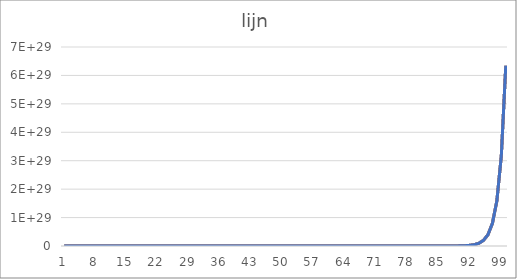
| Category | Series 2 | Series 3 | Series 1 | Series 0 |
|---|---|---|---|---|
| 0 | 1 | 1 | 1 | 1 |
| 1 | 2 | 2 | 2 | 2 |
| 2 | 4 | 4 | 4 | 4 |
| 3 | 8 | 8 | 8 | 8 |
| 4 | 16 | 16 | 16 | 16 |
| 5 | 32 | 32 | 32 | 32 |
| 6 | 64 | 64 | 64 | 64 |
| 7 | 128 | 128 | 128 | 128 |
| 8 | 256 | 256 | 256 | 256 |
| 9 | 512 | 512 | 512 | 512 |
| 10 | 1024 | 1024 | 1024 | 1024 |
| 11 | 2048 | 2048 | 2048 | 2048 |
| 12 | 4096 | 4096 | 4096 | 4096 |
| 13 | 8192 | 8192 | 8192 | 8192 |
| 14 | 16384 | 16384 | 16384 | 16384 |
| 15 | 32768 | 32768 | 32768 | 32768 |
| 16 | 65536 | 65536 | 65536 | 65536 |
| 17 | 131072 | 131072 | 131072 | 131072 |
| 18 | 262144 | 262144 | 262144 | 262144 |
| 19 | 524288 | 524288 | 524288 | 524288 |
| 20 | 1048576 | 1048576 | 1048576 | 1048576 |
| 21 | 2097152 | 2097152 | 2097152 | 2097152 |
| 22 | 4194304 | 4194304 | 4194304 | 4194304 |
| 23 | 8388608 | 8388608 | 8388608 | 8388608 |
| 24 | 16777216 | 16777216 | 16777216 | 16777216 |
| 25 | 33554432 | 33554432 | 33554432 | 33554432 |
| 26 | 67108864 | 67108864 | 67108864 | 67108864 |
| 27 | 134217728 | 134217728 | 134217728 | 134217728 |
| 28 | 268435456 | 268435456 | 268435456 | 268435456 |
| 29 | 536870912 | 536870912 | 536870912 | 536870912 |
| 30 | 1073741824 | 1073741824 | 1073741824 | 1073741824 |
| 31 | 2147483648 | 2147483648 | 2147483648 | 2147483648 |
| 32 | 4294967296 | 4294967296 | 4294967296 | 4294967296 |
| 33 | 8589934592 | 8589934592 | 8589934592 | 8589934592 |
| 34 | 17179869184 | 17179869184 | 17179869184 | 17179869184 |
| 35 | 34359738368 | 34359738368 | 34359738368 | 34359738368 |
| 36 | 68719476736 | 68719476736 | 68719476736 | 68719476736 |
| 37 | 137438953472 | 137438953472 | 137438953472 | 137438953472 |
| 38 | 274877906944 | 274877906944 | 274877906944 | 274877906944 |
| 39 | 549755813888 | 549755813888 | 549755813888 | 549755813888 |
| 40 | 1099511627776 | 1099511627776 | 1099511627776 | 1099511627776 |
| 41 | 2199023255552 | 2199023255552 | 2199023255552 | 2199023255552 |
| 42 | 4398046511104 | 4398046511104 | 4398046511104 | 4398046511104 |
| 43 | 8796093022208 | 8796093022208 | 8796093022208 | 8796093022208 |
| 44 | 17592186044416 | 17592186044416 | 17592186044416 | 17592186044416 |
| 45 | 35184372088832 | 35184372088832 | 35184372088832 | 35184372088832 |
| 46 | 70368744177664 | 70368744177664 | 70368744177664 | 70368744177664 |
| 47 | 140737488355328 | 140737488355328 | 140737488355328 | 140737488355328 |
| 48 | 281474976710656 | 281474976710656 | 281474976710656 | 281474976710656 |
| 49 | 562949953421312 | 562949953421312 | 562949953421312 | 562949953421312 |
| 50 | 1125899906842624 | 1125899906842624 | 1125899906842624 | 1125899906842624 |
| 51 | 2251799813685248 | 2251799813685248 | 2251799813685248 | 2251799813685248 |
| 52 | 4503599627370496 | 4503599627370496 | 4503599627370496 | 4503599627370496 |
| 53 | 9007199254740992 | 9007199254740992 | 9007199254740992 | 9007199254740992 |
| 54 | 18014398509481984 | 18014398509481984 | 18014398509481984 | 18014398509481984 |
| 55 | 36028797018963968 | 36028797018963968 | 36028797018963968 | 36028797018963968 |
| 56 | 72057594037927936 | 72057594037927936 | 72057594037927936 | 72057594037927936 |
| 57 | 144115188075855872 | 144115188075855872 | 144115188075855872 | 144115188075855872 |
| 58 | 288230376151711744 | 288230376151711744 | 288230376151711744 | 288230376151711744 |
| 59 | 576460752303423488 | 576460752303423488 | 576460752303423488 | 576460752303423488 |
| 60 | 1152921504606846976 | 1152921504606846976 | 1152921504606846976 | 1152921504606846976 |
| 61 | 2305843009213693952 | 2305843009213693952 | 2305843009213693952 | 2305843009213693952 |
| 62 | 4611686018427387904 | 4611686018427387904 | 4611686018427387904 | 4611686018427387904 |
| 63 | 9223372036854775808 | 9223372036854775808 | 9223372036854775808 | 9223372036854775808 |
| 64 | 18446744073709551616 | 18446744073709551616 | 18446744073709551616 | 18446744073709551616 |
| 65 | 36893488147419103232 | 36893488147419103232 | 36893488147419103232 | 36893488147419103232 |
| 66 | 73786976294838206464 | 73786976294838206464 | 73786976294838206464 | 73786976294838206464 |
| 67 | 147573952589676412928 | 147573952589676412928 | 147573952589676412928 | 147573952589676412928 |
| 68 | 295147905179352825856 | 295147905179352825856 | 295147905179352825856 | 295147905179352825856 |
| 69 | 590295810358705651712 | 590295810358705651712 | 590295810358705651712 | 590295810358705651712 |
| 70 | 1180591620717411303424 | 1180591620717411303424 | 1180591620717411303424 | 1180591620717411303424 |
| 71 | 2361183241434822606848 | 2361183241434822606848 | 2361183241434822606848 | 2361183241434822606848 |
| 72 | 4722366482869645213696 | 4722366482869645213696 | 4722366482869645213696 | 4722366482869645213696 |
| 73 | 9444732965739290427392 | 9444732965739290427392 | 9444732965739290427392 | 9444732965739290427392 |
| 74 | 18889465931478580854784 | 18889465931478580854784 | 18889465931478580854784 | 18889465931478580854784 |
| 75 | 37778931862957161709568 | 37778931862957161709568 | 37778931862957161709568 | 37778931862957161709568 |
| 76 | 75557863725914323419136 | 75557863725914323419136 | 75557863725914323419136 | 75557863725914323419136 |
| 77 | 151115727451828646838272 | 151115727451828646838272 | 151115727451828646838272 | 151115727451828646838272 |
| 78 | 302231454903657293676544 | 302231454903657293676544 | 302231454903657293676544 | 302231454903657293676544 |
| 79 | 604462909807314587353088 | 604462909807314587353088 | 604462909807314587353088 | 604462909807314587353088 |
| 80 | 1208925819614629174706176 | 1208925819614629174706176 | 1208925819614629174706176 | 1208925819614629174706176 |
| 81 | 2417851639229258349412352 | 2417851639229258349412352 | 2417851639229258349412352 | 2417851639229258349412352 |
| 82 | 4835703278458516698824704 | 4835703278458516698824704 | 4835703278458516698824704 | 4835703278458516698824704 |
| 83 | 9671406556917033397649408 | 9671406556917033397649408 | 9671406556917033397649408 | 9671406556917033397649408 |
| 84 | 19342813113834066795298816 | 19342813113834066795298816 | 19342813113834066795298816 | 19342813113834066795298816 |
| 85 | 38685626227668133590597632 | 38685626227668133590597632 | 38685626227668133590597632 | 38685626227668133590597632 |
| 86 | 77371252455336267181195264 | 77371252455336267181195264 | 77371252455336267181195264 | 77371252455336267181195264 |
| 87 | 154742504910672534362390528 | 154742504910672534362390528 | 154742504910672534362390528 | 154742504910672534362390528 |
| 88 | 309485009821345068724781056 | 309485009821345068724781056 | 309485009821345068724781056 | 309485009821345068724781056 |
| 89 | 618970019642690137449562112 | 618970019642690137449562112 | 618970019642690137449562112 | 618970019642690137449562112 |
| 90 | 1237940039285380274899124224 | 1237940039285380274899124224 | 1237940039285380274899124224 | 1237940039285380274899124224 |
| 91 | 2475880078570760549798248448 | 2475880078570760549798248448 | 2475880078570760549798248448 | 2475880078570760549798248448 |
| 92 | 4951760157141521099596496896 | 4951760157141521099596496896 | 4951760157141521099596496896 | 4951760157141521099596496896 |
| 93 | 9903520314283042199192993792 | 9903520314283042199192993792 | 9903520314283042199192993792 | 9903520314283042199192993792 |
| 94 | 19807040628566084398385987584 | 19807040628566084398385987584 | 19807040628566084398385987584 | 19807040628566084398385987584 |
| 95 | 39614081257132168796771975168 | 39614081257132168796771975168 | 39614081257132168796771975168 | 39614081257132168796771975168 |
| 96 | 79228162514264337593543950336 | 79228162514264337593543950336 | 79228162514264337593543950336 | 79228162514264337593543950336 |
| 97 | 158456325028528675187087900672 | 158456325028528675187087900672 | 158456325028528675187087900672 | 158456325028528675187087900672 |
| 98 | 316912650057057350374175801344 | 316912650057057350374175801344 | 316912650057057350374175801344 | 316912650057057350374175801344 |
| 99 | 633825300114114700748351602688 | 633825300114114700748351602688 | 633825300114114700748351602688 | 633825300114114700748351602688 |